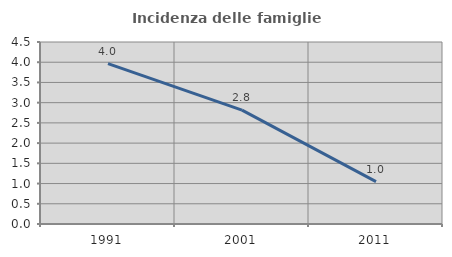
| Category | Incidenza delle famiglie numerose |
|---|---|
| 1991.0 | 3.966 |
| 2001.0 | 2.815 |
| 2011.0 | 1.047 |